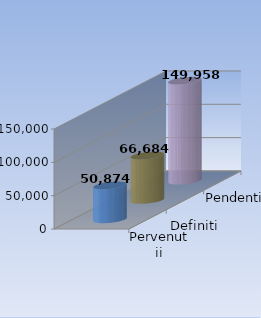
| Category | Pervenutii | Definiti | Pendenti |
|---|---|---|---|
| 0 | 50874 | 66684 | 149958 |